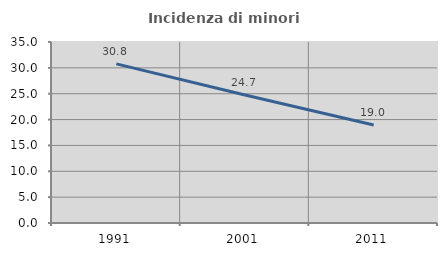
| Category | Incidenza di minori stranieri |
|---|---|
| 1991.0 | 30.769 |
| 2001.0 | 24.742 |
| 2011.0 | 18.966 |